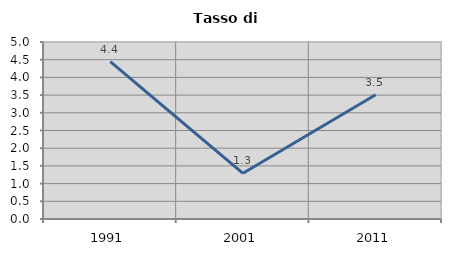
| Category | Tasso di disoccupazione   |
|---|---|
| 1991.0 | 4.444 |
| 2001.0 | 1.29 |
| 2011.0 | 3.509 |